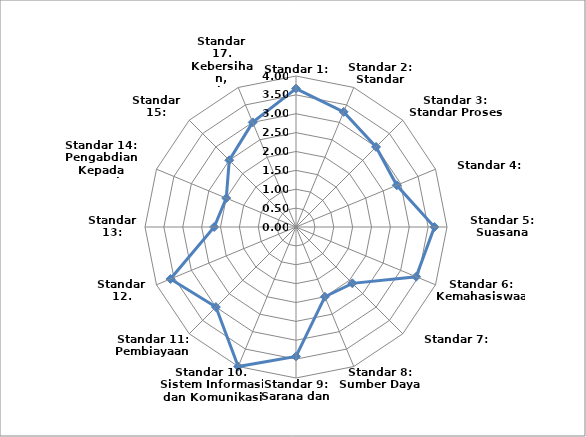
| Category | Nilai per standar |
|---|---|
| Standar 1: Identitas | 3.667 |
| Standar 2: Standar Kurikulum | 3.3 |
| Standar 3: Standar Proses | 3 |
| Standar 4: Evaluasi | 2.889 |
| Standar 5: Suasana Akademik | 3.667 |
| Standar 6: Kemahasiswaan | 3.444 |
| Standar 7: Lulusan  | 2.111 |
| Standar 8: Sumber Daya Manusia | 2 |
| Standar 9: Sarana dan Prasarana  | 3.429 |
| Standar 10. Sistem Informasi dan Komunikasi | 4 |
| Standar 11: Pembiayaan  | 3 |
| Standar 12. Pengelolaan | 3.6 |
| Standar 13: Penelitian | 2.167 |
| Standar 14: Pengabdian Kepada Masyarakat | 2 |
| Standar 15: Kerjasama  | 2.5 |
| Standar 17. Kebersihan, Kesehatan  Lingkungan | 3 |